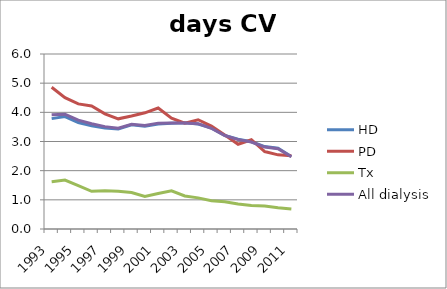
| Category | HD | PD | Tx | All dialysis |
|---|---|---|---|---|
| 1993 | 3.784 | 4.859 | 1.617 | 3.914 |
| 1994 | 3.856 | 4.505 | 1.677 | 3.937 |
| 1995 | 3.652 | 4.29 | 1.49 | 3.73 |
| 1996 | 3.539 | 4.22 | 1.292 | 3.61 |
| 1997 | 3.465 | 3.949 | 1.314 | 3.509 |
| 1998 | 3.43 | 3.777 | 1.298 | 3.457 |
| 1999 | 3.573 | 3.872 | 1.25 | 3.59 |
| 2000 | 3.523 | 3.984 | 1.12 | 3.546 |
| 2001 | 3.598 | 4.149 | 1.216 | 3.63 |
| 2002 | 3.629 | 3.801 | 1.309 | 3.63 |
| 2003 | 3.643 | 3.626 | 1.132 | 3.631 |
| 2004 | 3.601 | 3.745 | 1.067 | 3.61 |
| 2005 | 3.46 | 3.529 | 0.969 | 3.454 |
| 2006 | 3.21 | 3.224 | 0.935 | 3.205 |
| 2007 | 3.082 | 2.905 | 0.854 | 3.064 |
| 2008 | 2.99 | 3.061 | 0.806 | 2.983 |
| 2009 | 2.825 | 2.656 | 0.792 | 2.808 |
| 2010 | 2.766 | 2.543 | 0.729 | 2.75 |
| 2011 | 2.483 | 2.51 | 0.686 | 2.478 |